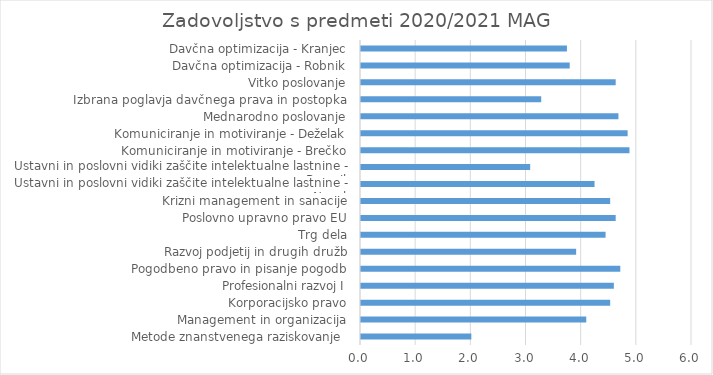
| Category | Series 0 |
|---|---|
| Metode znanstvenega raziskovanje  | 2 |
| Management in organizacija | 4.083 |
| Korporacijsko pravo | 4.517 |
| Profesionalni razvoj I | 4.583 |
| Pogodbeno pravo in pisanje pogodb | 4.7 |
| Razvoj podjetij in drugih družb | 3.9 |
| Trg dela | 4.433 |
| Poslovno upravno pravo EU | 4.617 |
| Krizni management in sanacije | 4.517 |
| Ustavni in poslovni vidiki zaščite intelektualne lastnine - Novak | 4.233 |
| Ustavni in poslovni vidiki zaščite intelektualne lastnine - Breznik | 3.067 |
| Komuniciranje in motiviranje - Brečko | 4.867 |
| Komuniciranje in motiviranje - Deželak | 4.833 |
| Mednarodno poslovanje | 4.667 |
| Izbrana poglavja davčnega prava in postopka | 3.267 |
| Vitko poslovanje | 4.617 |
| Davčna optimizacija - Robnik | 3.783 |
| Davčna optimizacija - Kranjec | 3.733 |